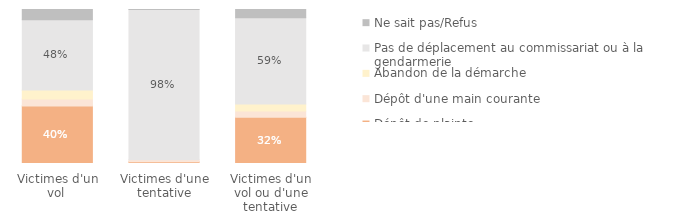
| Category | Dépôt de plainte | Dépôt d'une main courante | Abandon de la démarche | Pas de déplacement au commissariat ou à la gendarmerie | Ne sait pas/Refus |
|---|---|---|---|---|---|
| Victimes d'un vol  | 0.396 | 0.049 | 0.061 | 0.484 | 0.071 |
| Victimes d'une tentative | 0.011 | 0.013 | 0 | 0.976 | 0 |
| Victimes d'un vol ou d'une tentative | 0.315 | 0.042 | 0.048 | 0.587 | 0.056 |